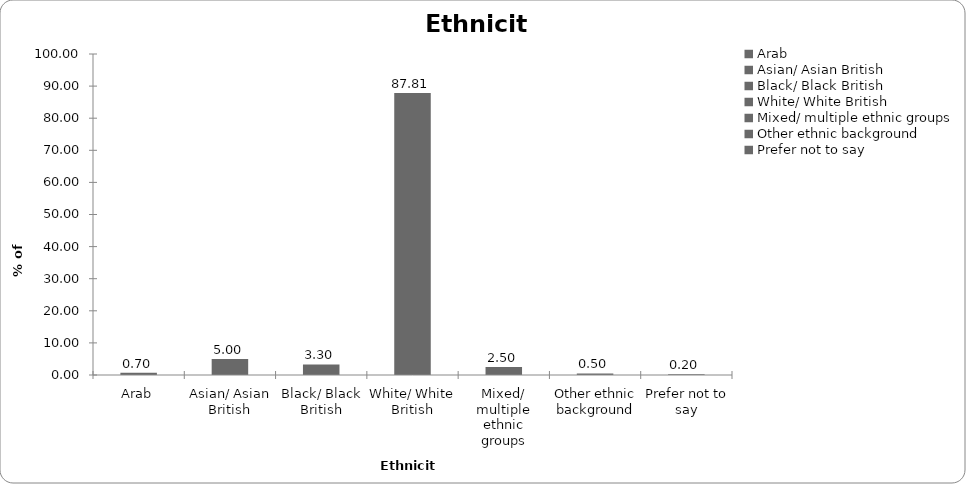
| Category | Ethnicity |
|---|---|
| Arab | 0.699 |
| Asian/ Asian British | 4.995 |
| Black/ Black British | 3.297 |
| White/ White British | 87.812 |
| Mixed/ multiple ethnic groups | 2.498 |
| Other ethnic background | 0.5 |
| Prefer not to say | 0.2 |